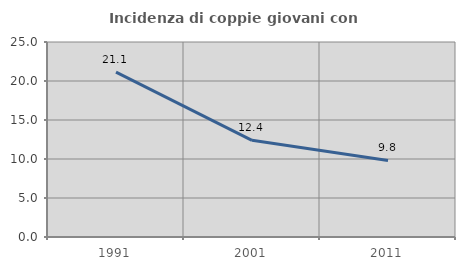
| Category | Incidenza di coppie giovani con figli |
|---|---|
| 1991.0 | 21.13 |
| 2001.0 | 12.395 |
| 2011.0 | 9.813 |